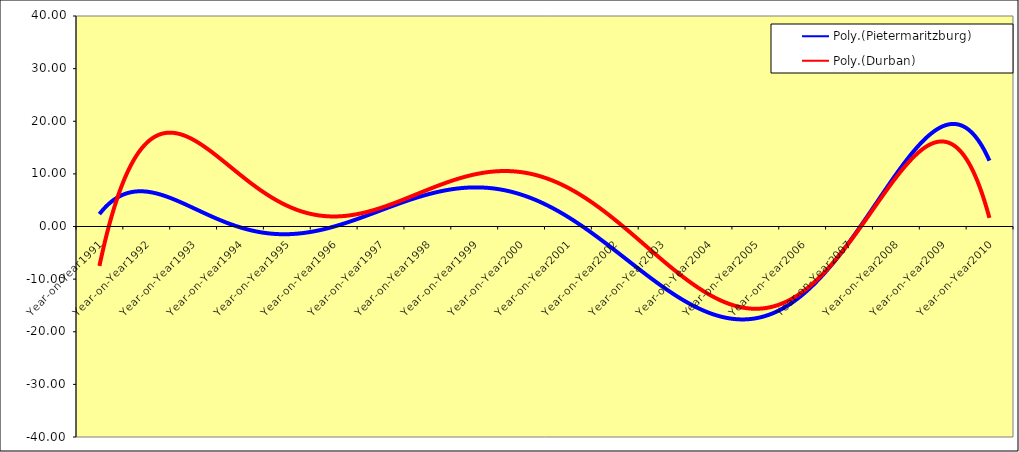
| Category | Pietermaritzburg | Durban |
|---|---|---|
| Year-on-Year1991 | 2.239 | -6.628 |
| Year-on-Year1992 | 5.869 | 8.596 |
| Year-on-Year1993 | 5.009 | 33.306 |
| Year-on-Year1994 | 0.521 | 0.362 |
| Year-on-Year1995 | -3.004 | -0.96 |
| Year-on-Year1996 | 3.49 | -10.367 |
| Year-on-Year1997 | 2.482 | 29.41 |
| Year-on-Year1998 | -8.601 | 6.445 |
| Year-on-Year1999 | 15.905 | 8.902 |
| Year-on-Year2000 | 5.48 | -4.268 |
| Year-on-Year2001 | 22.621 | -3.257 |
| Year-on-Year2002 | -9.94 | 21.643 |
| Year-on-Year2003 | -23.937 | -3.002 |
| Year-on-Year2004 | -35.923 | -7.906 |
| Year-on-Year2005 | 3.985 | -36.232 |
| Year-on-Year2006 | -9.935 | -10.284 |
| Year-on-Year2007 | -3.73 | 10.82 |
| Year-on-Year2008 | 10.7 | 1.391 |
| Year-on-Year2009 | 12.103 | 16.748 |
| Year-on-Year2010 | 15.672 | 1.842 |